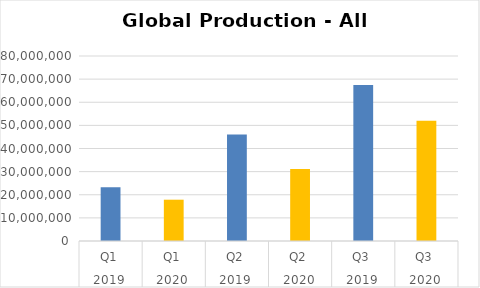
| Category | Series 0 |
|---|---|
| 0 | 23215783.453 |
| 1 | 17860338.017 |
| 2 | 46067626.836 |
| 3 | 31133068.134 |
| 4 | 67474325.451 |
| 5 | 52009457.89 |